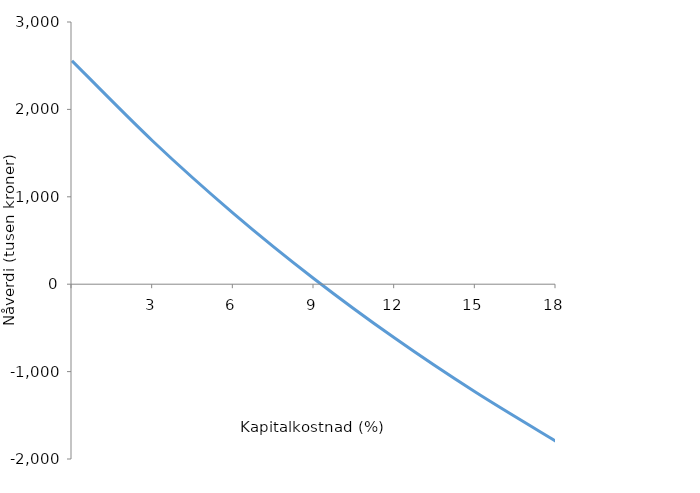
| Category | Nåverdi | 0 |
|---|---|---|
| nan | 2556 |  |
| 3.0 | 1638.559 |  |
| 6.0 | 811.195 |  |
| 9.0 | 62.723 |  |
| 12.0 | -616.382 |  |
| 15.0 | -1234.273 |  |
| 18.0 | -1797.954 |  |